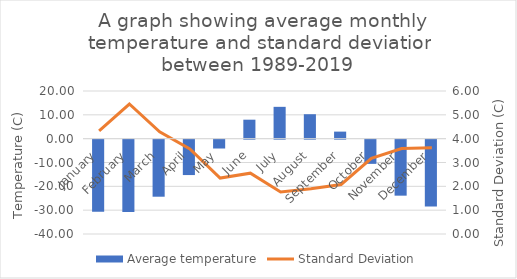
| Category | Average temperature |
|---|---|
| January | -30.207 |
| February | -30.329 |
| March | -23.934 |
| April | -14.85 |
| May | -3.71 |
| June | 7.963 |
| July | 13.355 |
| August | 10.259 |
| September | 2.959 |
| October | -10.152 |
| November | -23.494 |
| December | -27.992 |